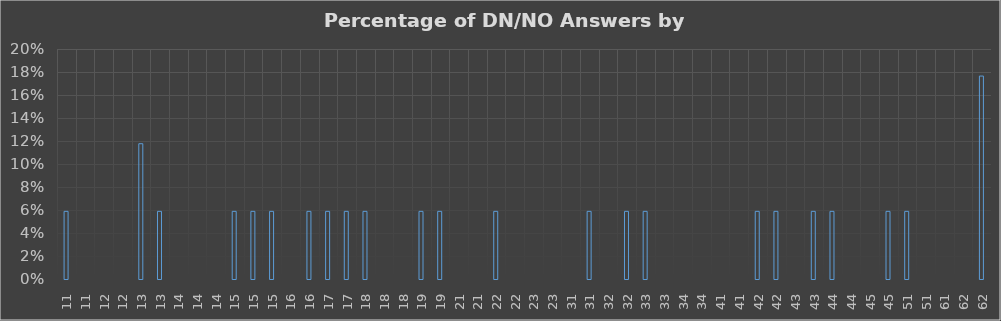
| Category | Series 0 |
|---|---|
| 11 | 0.059 |
| 11 | 0 |
| 12 | 0 |
| 12 | 0 |
| 13 | 0.118 |
| 13 | 0.059 |
| 14 | 0 |
| 14 | 0 |
| 14 | 0 |
| 15 | 0.059 |
| 15 | 0.059 |
| 15 | 0.059 |
| 16 | 0 |
| 16 | 0.059 |
| 17 | 0.059 |
| 17 | 0.059 |
| 18 | 0.059 |
| 18 | 0 |
| 18 | 0 |
| 19 | 0.059 |
| 19 | 0.059 |
| 21 | 0 |
| 21 | 0 |
| 22 | 0.059 |
| 22 | 0 |
| 23 | 0 |
| 23 | 0 |
| 31 | 0 |
| 31 | 0.059 |
| 32 | 0 |
| 32 | 0.059 |
| 33 | 0.059 |
| 33 | 0 |
| 34 | 0 |
| 34 | 0 |
| 41 | 0 |
| 41 | 0 |
| 42 | 0.059 |
| 42 | 0.059 |
| 43 | 0 |
| 43 | 0.059 |
| 44 | 0.059 |
| 44 | 0 |
| 45 | 0 |
| 45 | 0.059 |
| 51 | 0.059 |
| 51 | 0 |
| 61 | 0 |
| 62 | 0 |
| 62 | 0.176 |